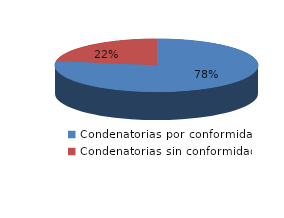
| Category | Series 0 |
|---|---|
| 0 | 215 |
| 1 | 62 |